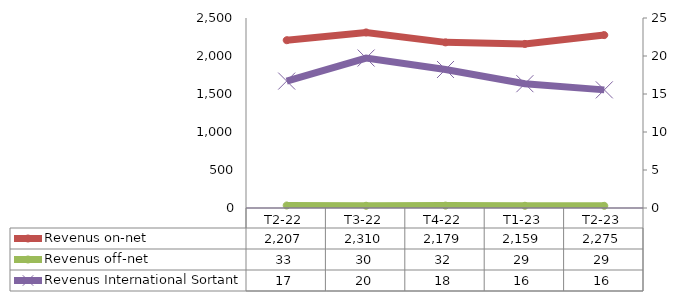
| Category | Revenus on-net | Revenus off-net |
|---|---|---|
| T2-22 | 2207.488 | 33.03 |
| T3-22 | 2310.244 | 29.718 |
| T4-22 | 2179.348 | 31.597 |
| T1-23 | 2159.381 | 29.449 |
| T2-23 | 2274.979 | 28.8 |